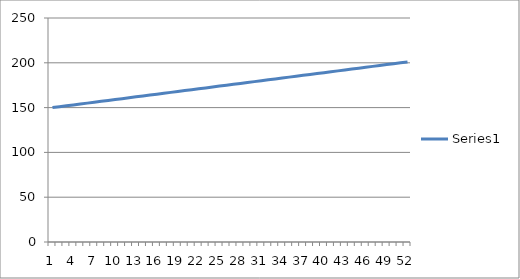
| Category | Series 0 |
|---|---|
| 0 | 150 |
| 1 | 151 |
| 2 | 152 |
| 3 | 153 |
| 4 | 154 |
| 5 | 155 |
| 6 | 156 |
| 7 | 157 |
| 8 | 158 |
| 9 | 159 |
| 10 | 160 |
| 11 | 161 |
| 12 | 162 |
| 13 | 163 |
| 14 | 164 |
| 15 | 165 |
| 16 | 166 |
| 17 | 167 |
| 18 | 168 |
| 19 | 169 |
| 20 | 170 |
| 21 | 171 |
| 22 | 172 |
| 23 | 173 |
| 24 | 174 |
| 25 | 175 |
| 26 | 176 |
| 27 | 177 |
| 28 | 178 |
| 29 | 179 |
| 30 | 180 |
| 31 | 181 |
| 32 | 182 |
| 33 | 183 |
| 34 | 184 |
| 35 | 185 |
| 36 | 186 |
| 37 | 187 |
| 38 | 188 |
| 39 | 189 |
| 40 | 190 |
| 41 | 191 |
| 42 | 192 |
| 43 | 193 |
| 44 | 194 |
| 45 | 195 |
| 46 | 196 |
| 47 | 197 |
| 48 | 198 |
| 49 | 199 |
| 50 | 200 |
| 51 | 201 |